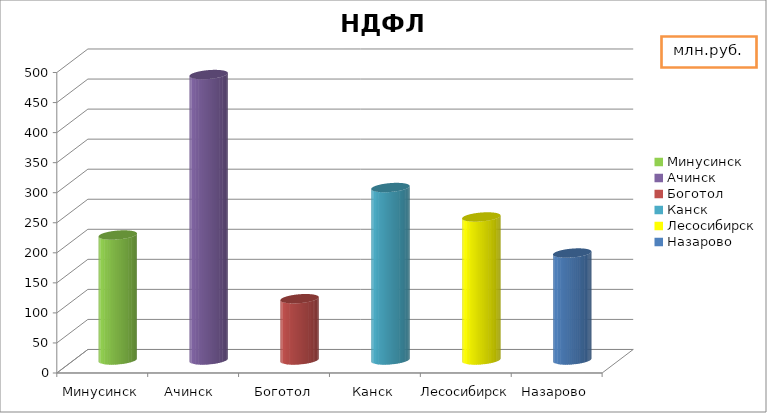
| Category | НДФЛ |
|---|---|
| Минусинск | 208 |
| Ачинск  | 475 |
| Боготол | 102 |
| Канск | 287 |
| Лесосибирск | 238 |
| Назарово | 178 |